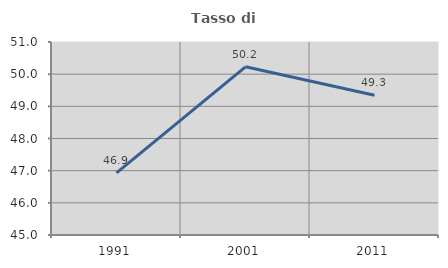
| Category | Tasso di occupazione   |
|---|---|
| 1991.0 | 46.93 |
| 2001.0 | 50.228 |
| 2011.0 | 49.345 |